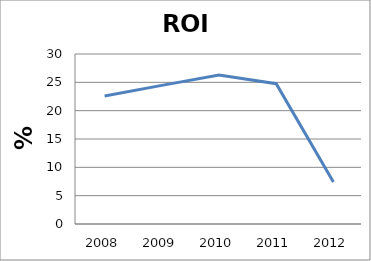
| Category | Series 0 |
|---|---|
| 2008.0 | 22.6 |
| 2009.0 | 24.46 |
| 2010.0 | 26.28 |
| 2011.0 | 24.75 |
| 2012.0 | 7.43 |